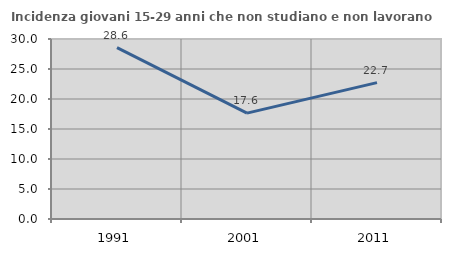
| Category | Incidenza giovani 15-29 anni che non studiano e non lavorano  |
|---|---|
| 1991.0 | 28.571 |
| 2001.0 | 17.647 |
| 2011.0 | 22.727 |